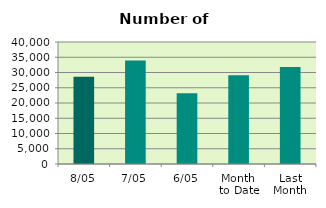
| Category | Series 0 |
|---|---|
| 8/05 | 28582 |
| 7/05 | 33898 |
| 6/05 | 23162 |
| Month 
to Date | 29129.6 |
| Last
Month | 31788.9 |